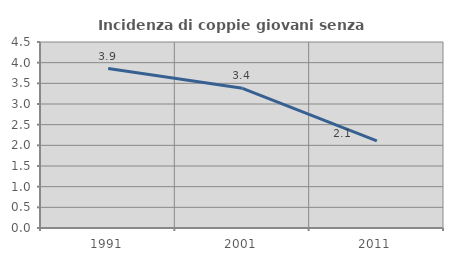
| Category | Incidenza di coppie giovani senza figli |
|---|---|
| 1991.0 | 3.857 |
| 2001.0 | 3.38 |
| 2011.0 | 2.108 |